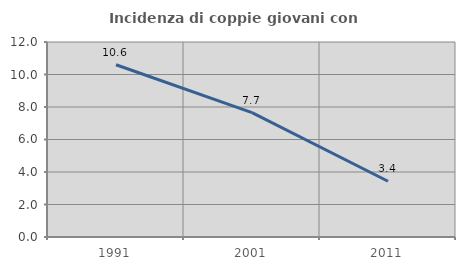
| Category | Incidenza di coppie giovani con figli |
|---|---|
| 1991.0 | 10.602 |
| 2001.0 | 7.658 |
| 2011.0 | 3.432 |